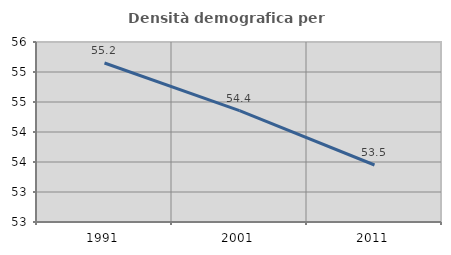
| Category | Densità demografica |
|---|---|
| 1991.0 | 55.151 |
| 2001.0 | 54.357 |
| 2011.0 | 53.45 |